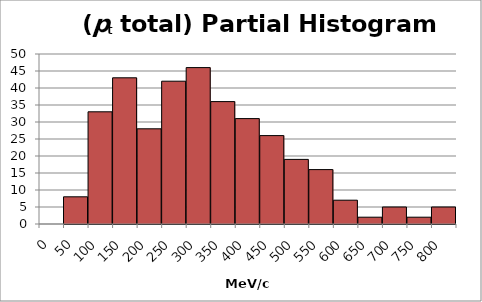
| Category | Series 1 |
|---|---|
| 0.0 | 0 |
| 50.0 | 8 |
| 100.0 | 33 |
| 150.0 | 43 |
| 200.0 | 28 |
| 250.0 | 42 |
| 300.0 | 46 |
| 350.0 | 36 |
| 400.0 | 31 |
| 450.0 | 26 |
| 500.0 | 19 |
| 550.0 | 16 |
| 600.0 | 7 |
| 650.0 | 2 |
| 700.0 | 5 |
| 750.0 | 2 |
| 800.0 | 5 |